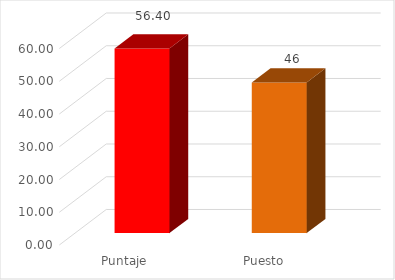
| Category | Series 0 |
|---|---|
| Puntaje  | 56.4 |
| Puesto | 46 |